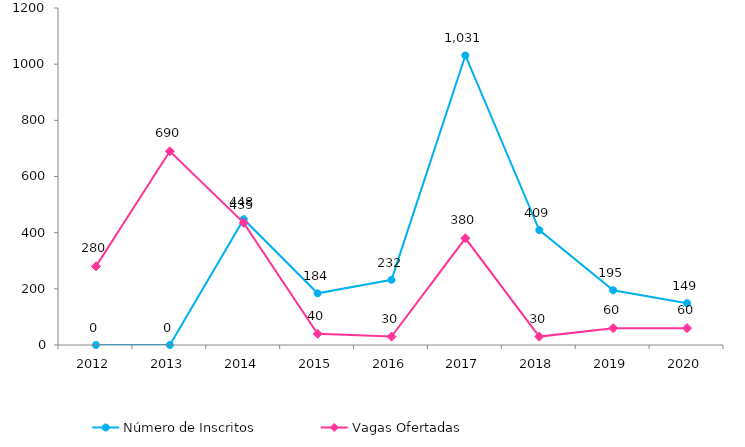
| Category | Número de Inscritos |
|---|---|
| 2012.0 | 0 |
| 2013.0 | 0 |
| 2014.0 | 448 |
| 2015.0 | 184 |
| 2016.0 | 232 |
| 2017.0 | 1031 |
| 2018.0 | 409 |
| 2019.0 | 195 |
| 2020.0 | 149 |